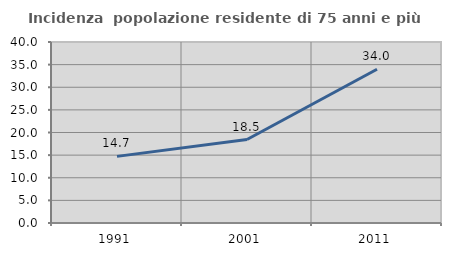
| Category | Incidenza  popolazione residente di 75 anni e più |
|---|---|
| 1991.0 | 14.722 |
| 2001.0 | 18.45 |
| 2011.0 | 33.971 |